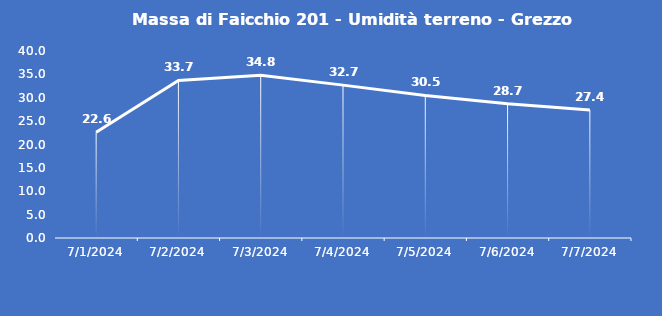
| Category | Massa di Faicchio 201 - Umidità terreno - Grezzo (%VWC) |
|---|---|
| 7/1/24 | 22.6 |
| 7/2/24 | 33.7 |
| 7/3/24 | 34.8 |
| 7/4/24 | 32.7 |
| 7/5/24 | 30.5 |
| 7/6/24 | 28.7 |
| 7/7/24 | 27.4 |